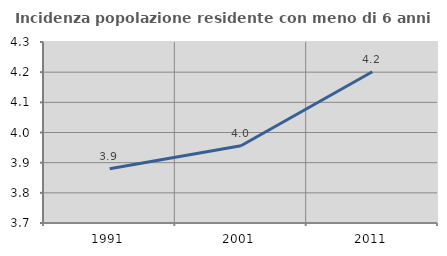
| Category | Incidenza popolazione residente con meno di 6 anni |
|---|---|
| 1991.0 | 3.88 |
| 2001.0 | 3.956 |
| 2011.0 | 4.201 |